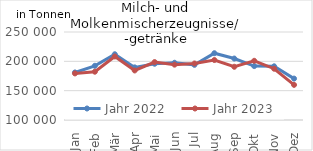
| Category | Jahr 2022 | Jahr 2023 |
|---|---|---|
| Jan | 181044.021 | 179414.545 |
| Feb | 192369.556 | 182302.488 |
| Mär | 212076.904 | 208290.404 |
| Apr | 189688.681 | 184443.633 |
| Mai | 195900.306 | 198708.35 |
| Jun | 197565.919 | 194350.486 |
| Jul | 194002.852 | 196347.913 |
| Aug | 213842.463 | 202218.399 |
| Sep | 204747.46 | 190714.892 |
| Okt | 191903.804 | 200895.24 |
| Nov | 191513.516 | 187397.797 |
| Dez | 170569.614 | 159894.141 |